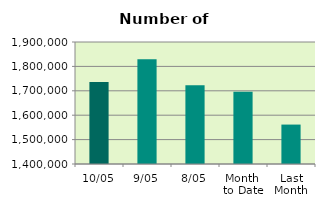
| Category | Series 0 |
|---|---|
| 10/05 | 1735704 |
| 9/05 | 1829330 |
| 8/05 | 1722342 |
| Month 
to Date | 1696235.714 |
| Last
Month | 1561575.6 |